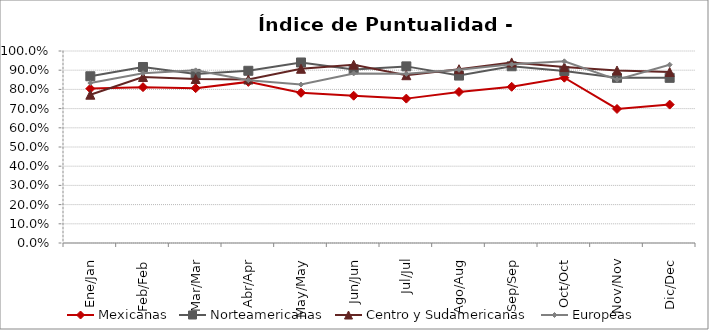
| Category | Mexicanas | Norteamericanas | Centro y Sudamericanas | Europeas |
|---|---|---|---|---|
| Ene/Jan | 0.804 | 0.868 | 0.772 | 0.833 |
| Feb/Feb | 0.812 | 0.917 | 0.865 | 0.884 |
| Mar/Mar | 0.807 | 0.881 | 0.854 | 0.899 |
| Abr/Apr | 0.839 | 0.897 | 0.852 | 0.848 |
| May/May | 0.782 | 0.94 | 0.908 | 0.825 |
| Jun/Jun | 0.767 | 0.904 | 0.929 | 0.883 |
| Jul/Jul | 0.752 | 0.92 | 0.874 | 0.881 |
| Ago/Aug | 0.787 | 0.872 | 0.905 | 0.902 |
| Sep/Sep | 0.814 | 0.921 | 0.941 | 0.93 |
| Oct/Oct | 0.861 | 0.896 | 0.916 | 0.946 |
| Nov/Nov | 0.698 | 0.86 | 0.898 | 0.851 |
| Dic/Dec | 0.721 | 0.86 | 0.891 | 0.929 |